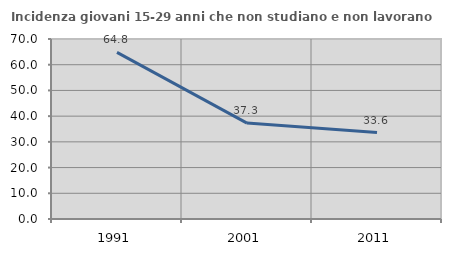
| Category | Incidenza giovani 15-29 anni che non studiano e non lavorano  |
|---|---|
| 1991.0 | 64.785 |
| 2001.0 | 37.288 |
| 2011.0 | 33.613 |